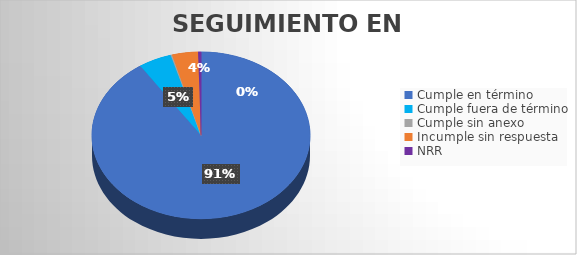
| Category | TOTAL |
|---|---|
| Cumple en término | 424 |
| Cumple fuera de término | 23 |
| Cumple sin anexo | 1 |
| Incumple sin respuesta | 18 |
| NRR | 2 |